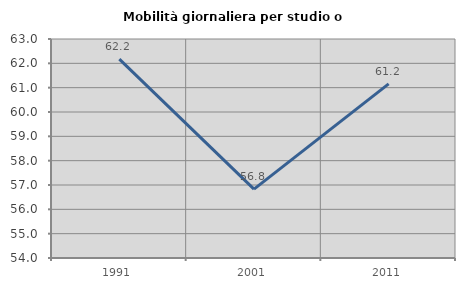
| Category | Mobilità giornaliera per studio o lavoro |
|---|---|
| 1991.0 | 62.175 |
| 2001.0 | 56.832 |
| 2011.0 | 61.157 |